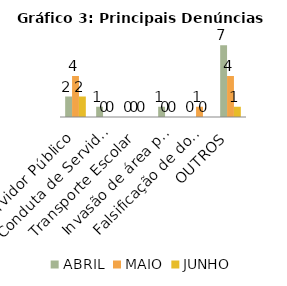
| Category | ABRIL | MAIO | JUNHO |
|---|---|---|---|
| Servidor Público | 2 | 4 | 2 |
| Conduta de Servidor do DETRAN-DF | 1 | 0 | 0 |
| Transporte Escolar | 0 | 0 | 0 |
| Invasão de área pública | 1 | 0 | 0 |
| Falsificação de documentos | 0 | 1 | 0 |
| OUTROS | 7 | 4 | 1 |